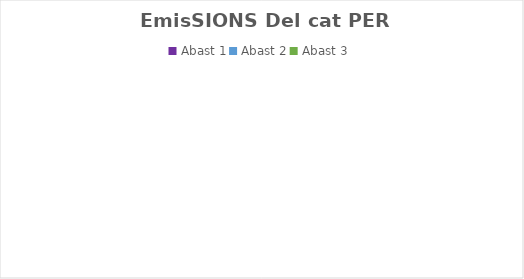
| Category | Series 0 |
|---|---|
| Abast 1 | 0 |
| Abast 2 | 0 |
| Abast 3 | 0 |